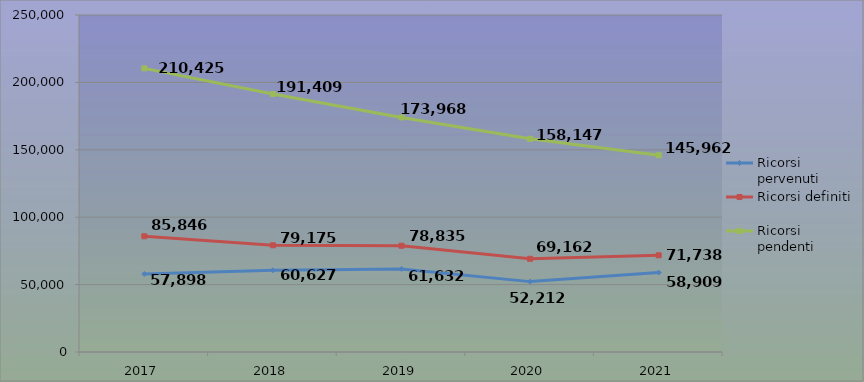
| Category | Ricorsi pervenuti | Ricorsi definiti | Ricorsi pendenti |
|---|---|---|---|
| 2017.0 | 57898 | 85846 | 210425 |
| 2018.0 | 60627 | 79175 | 191409 |
| 2019.0 | 61632 | 78835 | 173968 |
| 2020.0 | 52212 | 69162 | 158147 |
| 2021.0 | 58909 | 71738 | 145962 |